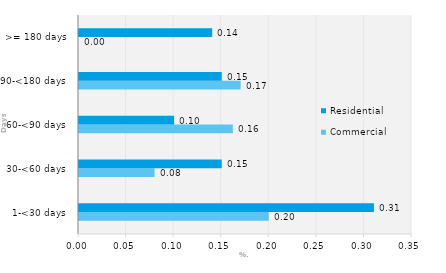
| Category | Commercial | Residential |
|---|---|---|
| 1-<30 days | 0.199 | 0.31 |
| 30-<60 days | 0.079 | 0.15 |
| 60-<90 days | 0.162 | 0.1 |
| 90-<180 days | 0.17 | 0.15 |
| >= 180 days | 0 | 0.14 |